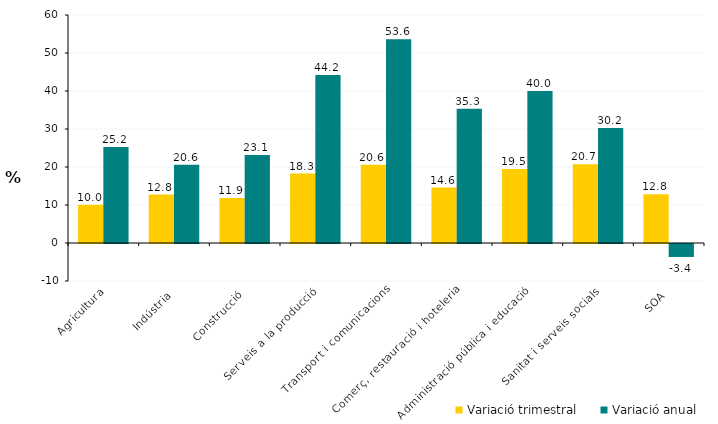
| Category | Variació trimestral | Variació anual |
|---|---|---|
| Agricultura | 10.042 | 25.238 |
| Indústria | 12.762 | 20.617 |
| Construcció | 11.863 | 23.146 |
| Serveis a la producció | 18.257 | 44.235 |
| Transport i comunicacions | 20.608 | 53.609 |
| Comerç, restauració i hoteleria | 14.597 | 35.316 |
| Administració pública i educació | 19.503 | 39.992 |
| Sanitat i serveis socials | 20.726 | 30.239 |
| SOA | 12.832 | -3.409 |